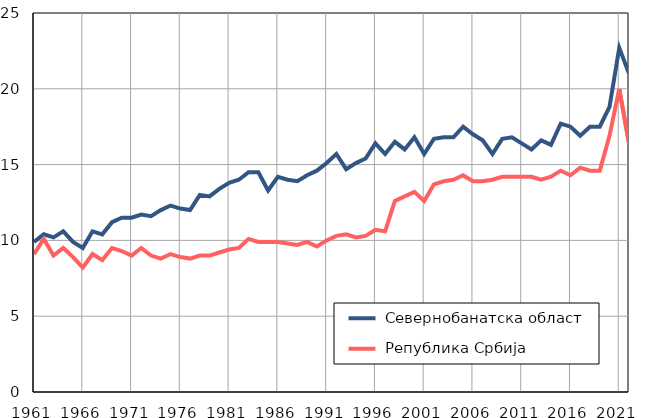
| Category |  Севернобанатска област |  Република Србија |
|---|---|---|
| 1961.0 | 9.9 | 9.1 |
| 1962.0 | 10.4 | 10.1 |
| 1963.0 | 10.2 | 9 |
| 1964.0 | 10.6 | 9.5 |
| 1965.0 | 9.9 | 8.9 |
| 1966.0 | 9.5 | 8.2 |
| 1967.0 | 10.6 | 9.1 |
| 1968.0 | 10.4 | 8.7 |
| 1969.0 | 11.2 | 9.5 |
| 1970.0 | 11.5 | 9.3 |
| 1971.0 | 11.5 | 9 |
| 1972.0 | 11.7 | 9.5 |
| 1973.0 | 11.6 | 9 |
| 1974.0 | 12 | 8.8 |
| 1975.0 | 12.3 | 9.1 |
| 1976.0 | 12.1 | 8.9 |
| 1977.0 | 12 | 8.8 |
| 1978.0 | 13 | 9 |
| 1979.0 | 12.9 | 9 |
| 1980.0 | 13.4 | 9.2 |
| 1981.0 | 13.8 | 9.4 |
| 1982.0 | 14 | 9.5 |
| 1983.0 | 14.5 | 10.1 |
| 1984.0 | 14.5 | 9.9 |
| 1985.0 | 13.3 | 9.9 |
| 1986.0 | 14.2 | 9.9 |
| 1987.0 | 14 | 9.8 |
| 1988.0 | 13.9 | 9.7 |
| 1989.0 | 14.3 | 9.9 |
| 1990.0 | 14.6 | 9.6 |
| 1991.0 | 15.1 | 10 |
| 1992.0 | 15.7 | 10.3 |
| 1993.0 | 14.7 | 10.4 |
| 1994.0 | 15.1 | 10.2 |
| 1995.0 | 15.4 | 10.3 |
| 1996.0 | 16.4 | 10.7 |
| 1997.0 | 15.7 | 10.6 |
| 1998.0 | 16.5 | 12.6 |
| 1999.0 | 16 | 12.9 |
| 2000.0 | 16.8 | 13.2 |
| 2001.0 | 15.7 | 12.6 |
| 2002.0 | 16.7 | 13.7 |
| 2003.0 | 16.8 | 13.9 |
| 2004.0 | 16.8 | 14 |
| 2005.0 | 17.5 | 14.3 |
| 2006.0 | 17 | 13.9 |
| 2007.0 | 16.6 | 13.9 |
| 2008.0 | 15.7 | 14 |
| 2009.0 | 16.7 | 14.2 |
| 2010.0 | 16.8 | 14.2 |
| 2011.0 | 16.4 | 14.2 |
| 2012.0 | 16 | 14.2 |
| 2013.0 | 16.6 | 14 |
| 2014.0 | 16.3 | 14.2 |
| 2015.0 | 17.7 | 14.6 |
| 2016.0 | 17.5 | 14.3 |
| 2017.0 | 16.9 | 14.8 |
| 2018.0 | 17.5 | 14.6 |
| 2019.0 | 17.5 | 14.6 |
| 2020.0 | 18.8 | 16.9 |
| 2021.0 | 22.7 | 20 |
| 2022.0 | 21 | 16.4 |